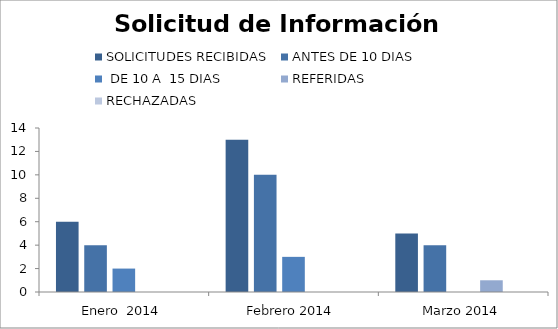
| Category | SOLICITUDES RECIBIDAS | ANTES DE 10 DIAS |  DE 10 A  15 DIAS  | REFERIDAS | RECHAZADAS |
|---|---|---|---|---|---|
| Enero  2014 | 6 | 4 | 2 | 0 | 0 |
| Febrero 2014 | 13 | 10 | 3 | 0 | 0 |
| Marzo 2014 | 5 | 4 | 0 | 1 | 0 |